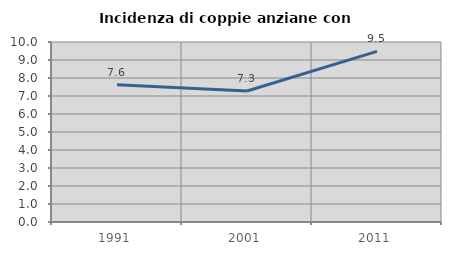
| Category | Incidenza di coppie anziane con figli |
|---|---|
| 1991.0 | 7.627 |
| 2001.0 | 7.281 |
| 2011.0 | 9.483 |